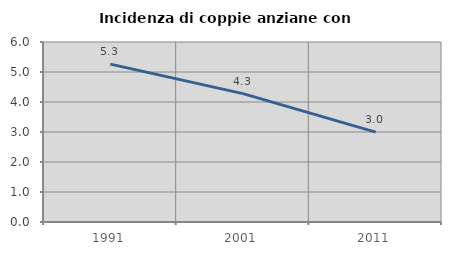
| Category | Incidenza di coppie anziane con figli |
|---|---|
| 1991.0 | 5.263 |
| 2001.0 | 4.278 |
| 2011.0 | 2.994 |